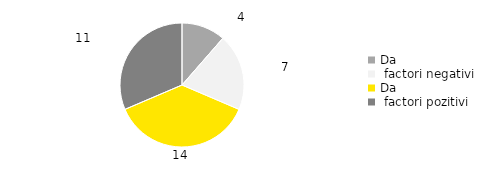
| Category | Total |
|---|---|
| Da, factori negativi | 0.114 |
| Da, factori pozitivi | 0.2 |
| Nu | 0.371 |
| Nu știu / Nu răspund | 0.314 |